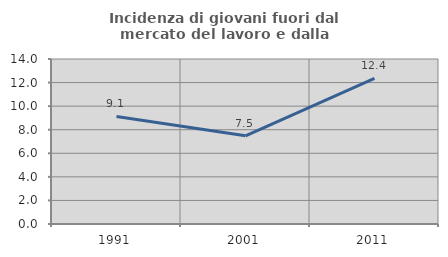
| Category | Incidenza di giovani fuori dal mercato del lavoro e dalla formazione  |
|---|---|
| 1991.0 | 9.122 |
| 2001.0 | 7.483 |
| 2011.0 | 12.355 |